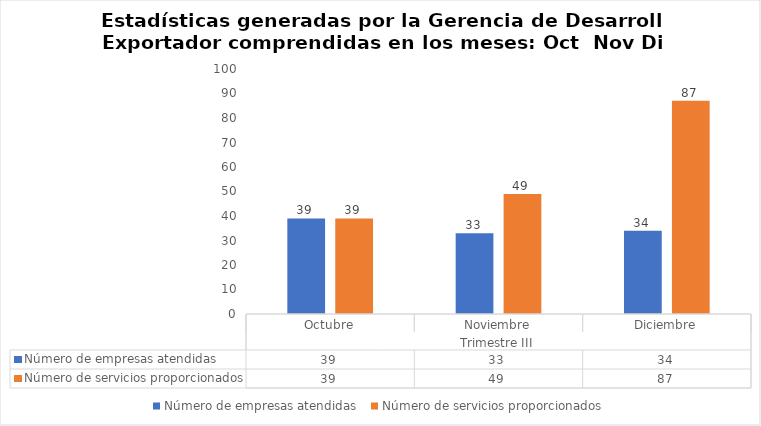
| Category | Número de empresas atendidas  | Número de servicios proporcionados |
|---|---|---|
| 0 | 39 | 39 |
| 1 | 33 | 49 |
| 2 | 34 | 87 |